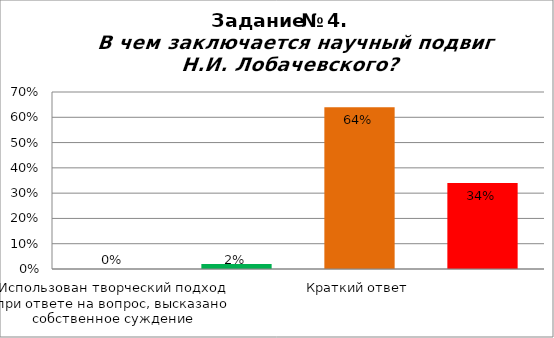
| Category | В чем заключается научный подвиг Н.И. Лобачевского? |
|---|---|
| Использован творческий подход при ответе на вопрос, высказано собственное суждение | 0 |
| При ответе на вопрос использованы материалы текста, без собственной оценки событий | 0.02 |
| Краткий ответ | 0.64 |
| Неверный ответ или не приступал | 0.34 |